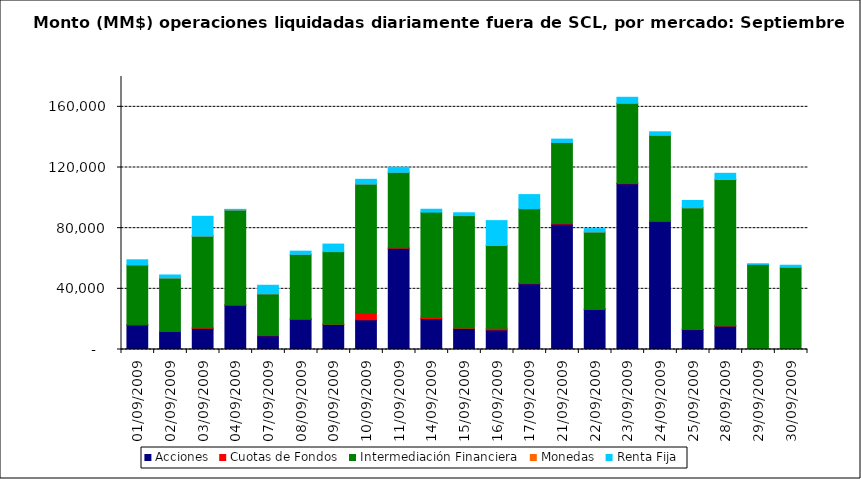
| Category | Acciones | Cuotas de Fondos | Intermediación Financiera | Monedas | Renta Fija |
|---|---|---|---|---|---|
| 01/09/2009 | 16300.533 | 59.733 | 39374.535 | 0 | 3406.493 |
| 02/09/2009 | 11958.204 | 53.676 | 35161.467 | 14.949 | 1945.814 |
| 03/09/2009 | 13965.351 | 308.234 | 60487.33 | 35.488 | 13029.734 |
| 04/09/2009 | 29253.527 | 227.268 | 62487.581 | 24.077 | 411.954 |
| 07/09/2009 | 9085.792 | 286.146 | 27352.822 | 8.05 | 5610.203 |
| 08/09/2009 | 19932.926 | 361.134 | 42422.993 | 27.65 | 2095.025 |
| 09/09/2009 | 16440.86 | 136.276 | 47947.239 | 0 | 4984.374 |
| 10/09/2009 | 19610.487 | 4496.546 | 84992.16 | 5.43 | 3097.554 |
| 11/09/2009 | 66778.49 | 229.786 | 49813.436 | 4.15 | 3327.905 |
| 14/09/2009 | 20429.368 | 1081.712 | 69063.069 | 0 | 1899.507 |
| 15/09/2009 | 13793.208 | 358.837 | 74148.2 | 0.68 | 1844.165 |
| 16/09/2009 | 12942.747 | 1113.462 | 54487.318 | 16.259 | 16407.14 |
| 17/09/2009 | 43371.002 | 314.232 | 49188.605 | 10.724 | 9239.11 |
| 21/09/2009 | 82726.661 | 396.159 | 53385.814 | 6.8 | 2202.087 |
| 22/09/2009 | 26432.518 | 189.635 | 50851.09 | 48.985 | 2193.547 |
| 23/09/2009 | 109305.19 | 289.242 | 52828.056 | 1.05 | 3867.983 |
| 24/09/2009 | 84570.124 | 84.336 | 56592.339 | 45.902 | 2246.933 |
| 25/09/2009 | 13132.341 | 5.509 | 80298.378 | 22.372 | 4774.597 |
| 28/09/2009 | 15474.543 | 241.285 | 96357.102 | 6.3 | 4085.41 |
| 29/09/2009 | 26.094 | 0 | 56102.431 | 0 | 272.614 |
| 30/09/2009 | 328.541 | 0 | 53860.703 | 0 | 1367.718 |